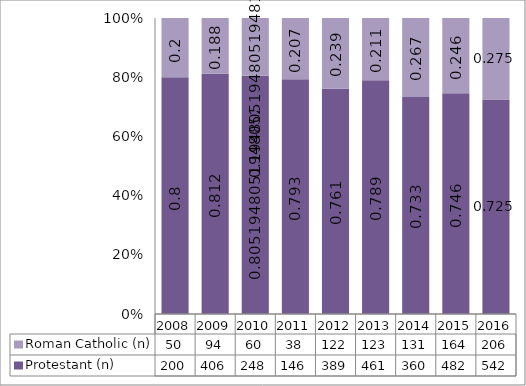
| Category | Protestant (n) | Roman Catholic (n) |
|---|---|---|
| 2008.0 | 200 | 50 |
| 2009.0 | 406 | 94 |
| 2010.0 | 248 | 60 |
| 2011.0 | 146 | 38 |
| 2012.0 | 389 | 122 |
| 2013.0 | 461 | 123 |
| 2014.0 | 360 | 131 |
| 2015.0 | 482 | 164 |
| 2016.0 | 542 | 206 |